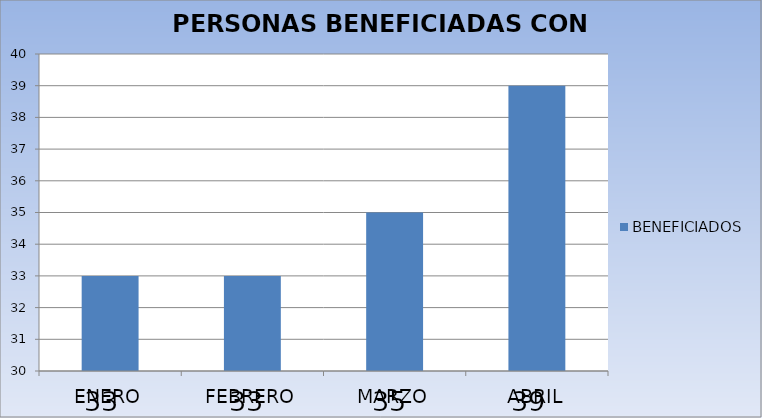
| Category | BENEFICIADOS |
|---|---|
| ENERO | 33 |
| FEBRERO | 33 |
| MARZO | 35 |
| ABRIL | 39 |